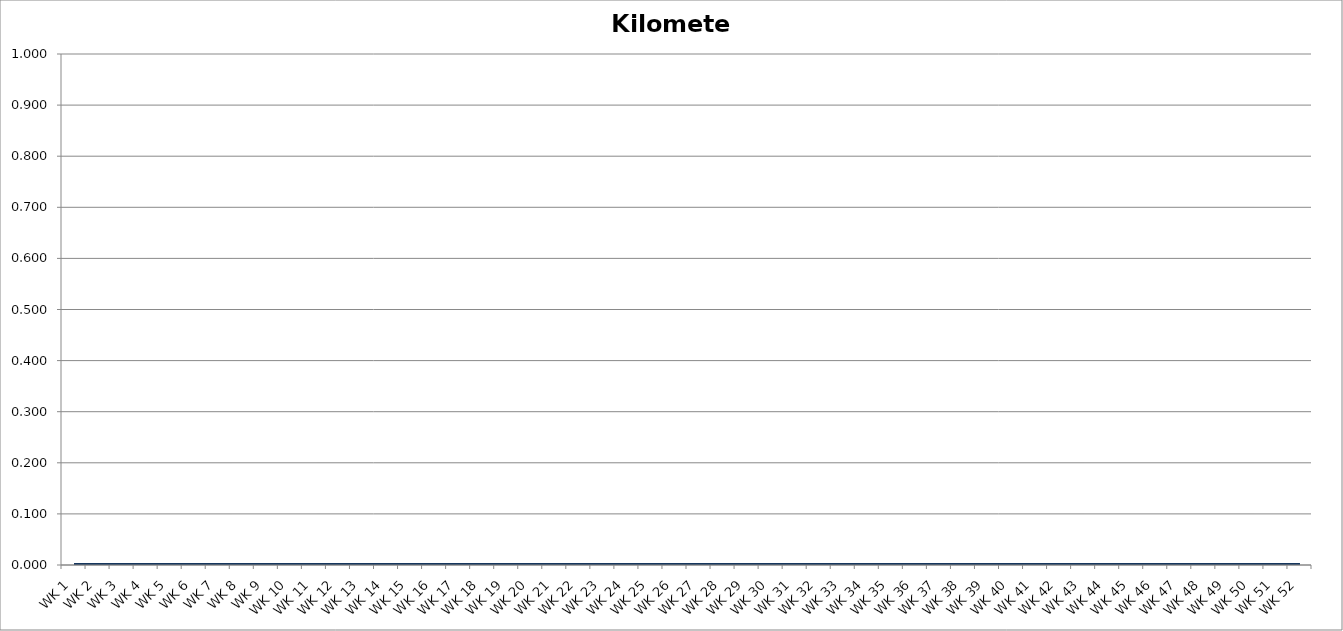
| Category | Kilometer |
|---|---|
| WK 1 | 0 |
| WK 2 | 0 |
| WK 3 | 0 |
| WK 4 | 0 |
| WK 5 | 0 |
| WK 6 | 0 |
| WK 7 | 0 |
| WK 8 | 0 |
| WK 9 | 0 |
| WK 10 | 0 |
| WK 11 | 0 |
| WK 12 | 0 |
| WK 13 | 0 |
| WK 14 | 0 |
| WK 15 | 0 |
| WK 16 | 0 |
| WK 17 | 0 |
| WK 18 | 0 |
| WK 19 | 0 |
| WK 20 | 0 |
| WK 21 | 0 |
| WK 22 | 0 |
| WK 23 | 0 |
| WK 24 | 0 |
| WK 25 | 0 |
| WK 26 | 0 |
| WK 27 | 0 |
| WK 28 | 0 |
| WK 29 | 0 |
| WK 30 | 0 |
| WK 31 | 0 |
| WK 32 | 0 |
| WK 33 | 0 |
| WK 34 | 0 |
| WK 35 | 0 |
| WK 36 | 0 |
| WK 37 | 0 |
| WK 38 | 0 |
| WK 39 | 0 |
| WK 40 | 0 |
| WK 41 | 0 |
| WK 42 | 0 |
| WK 43 | 0 |
| WK 44 | 0 |
| WK 45 | 0 |
| WK 46 | 0 |
| WK 47 | 0 |
| WK 48 | 0 |
| WK 49 | 0 |
| WK 50 | 0 |
| WK 51 | 0 |
| WK 52 | 0 |